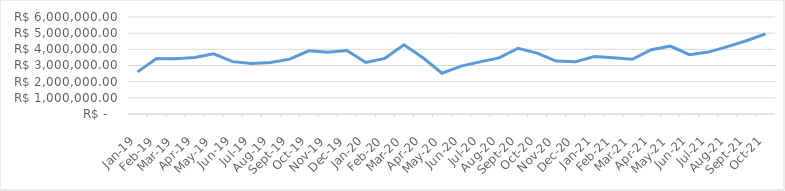
| Category | Series 0 |
|---|---|
| 2019-01-01 | 2605358.87 |
| 2019-02-01 | 3439016.48 |
| 2019-03-01 | 3423811.93 |
| 2019-04-01 | 3500209.03 |
| 2019-05-01 | 3722587.5 |
| 2019-06-01 | 3240065.54 |
| 2019-07-01 | 3128994.29 |
| 2019-08-01 | 3181464.39 |
| 2019-09-01 | 3393157 |
| 2019-10-01 | 3910157.2 |
| 2019-11-01 | 3817506.6 |
| 2019-12-01 | 3930347.86 |
| 2020-01-01 | 3183974.65 |
| 2020-02-01 | 3442569.02 |
| 2020-03-01 | 4280151.89 |
| 2020-04-01 | 3475617.87 |
| 2020-05-01 | 2520181.3 |
| 2020-06-01 | 2959599.26 |
| 2020-07-01 | 3225071.86 |
| 2020-08-01 | 3468201.22 |
| 2020-09-01 | 4067786.95 |
| 2020-10-01 | 3766980.88 |
| 2020-11-01 | 3276905.86 |
| 2020-12-01 | 3225765.16 |
| 2021-01-01 | 3551048.88 |
| 2021-02-01 | 3478993.96 |
| 2021-03-01 | 3384397.38 |
| 2021-04-01 | 3979942.57 |
| 2021-05-01 | 4197338.11 |
| 2021-06-01 | 3670910.06 |
| 2021-07-01 | 3829677.11 |
| 2021-08-01 | 4164336.82 |
| 2021-09-01 | 4533119.45 |
| 2021-10-01 | 4959284.57 |